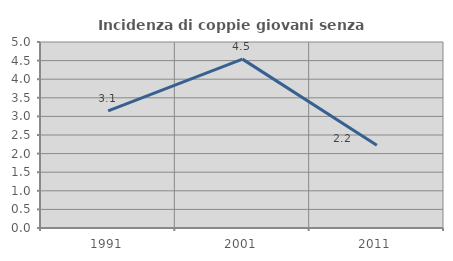
| Category | Incidenza di coppie giovani senza figli |
|---|---|
| 1991.0 | 3.146 |
| 2001.0 | 4.54 |
| 2011.0 | 2.225 |